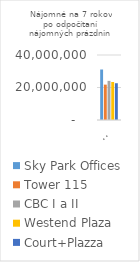
| Category | Sky Park Offices | Tower 115 | CBC I a II | Westend Plaza | Court+Plazza |
|---|---|---|---|---|---|
| 18756,44 m2 | 31073394.66 | 21758339.28 | 24082623.788 | 23390024.85 | 22625024.85 |